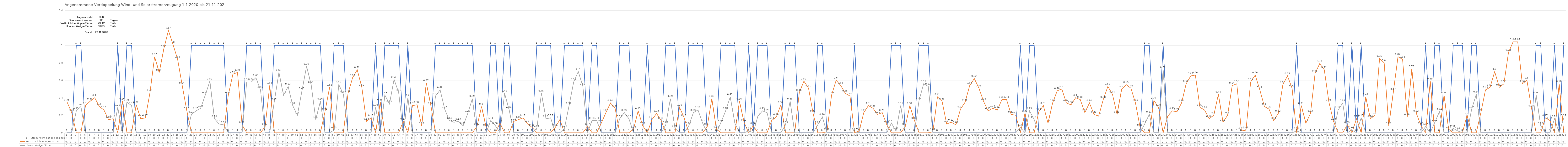
| Category | 1 = Strom reicht auf den Tag aus | Zussätzlich benötigter Strom | Überschüssiger Strom |
|---|---|---|---|
| 0 | 0 | 0.35 | 0 |
| 1 | 0 | 0.23 | 0 |
| 2 | 1 | 0 | 0.25 |
| 3 | 1 | 0 | 0.3 |
| 4 | 0 | 0.31 | 0 |
| 5 | 0 | 0.36 | 0 |
| 6 | 0 | 0.4 | 0 |
| 7 | 0 | 0.3 | 0 |
| 8 | 0 | 0.26 | 0 |
| 9 | 0 | 0.15 | 0 |
| 10 | 0 | 0.16 | 0 |
| 11 | 1 | 0 | 0.29 |
| 12 | 0 | 0.36 | 0 |
| 13 | 1 | 0 | 0.35 |
| 14 | 1 | 0 | 0.31 |
| 15 | 0 | 0.32 | 0 |
| 16 | 0 | 0.16 | 0 |
| 17 | 0 | 0.17 | 0 |
| 18 | 0 | 0.46 | 0 |
| 19 | 0 | 0.87 | 0 |
| 20 | 0 | 0.69 | 0 |
| 21 | 0 | 0.96 | 0 |
| 22 | 0 | 1.17 | 0 |
| 23 | 0 | 1.01 | 0 |
| 24 | 0 | 0.84 | 0 |
| 25 | 0 | 0.54 | 0 |
| 26 | 0 | 0.25 | 0 |
| 27 | 1 | 0 | 0.21 |
| 28 | 1 | 0 | 0.25 |
| 29 | 1 | 0 | 0.28 |
| 30 | 1 | 0 | 0.43 |
| 31 | 1 | 0 | 0.59 |
| 32 | 1 | 0 | 0.16 |
| 33 | 1 | 0 | 0.1 |
| 34 | 1 | 0 | 0.09 |
| 35 | 0 | 0.43 | 0 |
| 36 | 0 | 0.67 | 0 |
| 37 | 0 | 0.69 | 0 |
| 38 | 0 | 0.09 | 0 |
| 39 | 1 | 0 | 0.58 |
| 40 | 1 | 0 | 0.58 |
| 41 | 1 | 0 | 0.63 |
| 42 | 1 | 0 | 0.49 |
| 43 | 0 | 0.07 | 0 |
| 44 | 0 | 0.54 | 0 |
| 45 | 1 | 0 | 0.36 |
| 46 | 1 | 0 | 0.69 |
| 47 | 1 | 0 | 0.43 |
| 48 | 1 | 0 | 0.53 |
| 49 | 1 | 0 | 0.31 |
| 50 | 1 | 0 | 0.2 |
| 51 | 1 | 0 | 0.48 |
| 52 | 1 | 0 | 0.76 |
| 53 | 1 | 0 | 0.55 |
| 54 | 1 | 0 | 0.15 |
| 55 | 1 | 0 | 0.36 |
| 56 | 0 | 0.24 | 0 |
| 57 | 0 | 0.52 | 0 |
| 58 | 1 | 0 | 0.03 |
| 59 | 1 | 0 | 0.55 |
| 60 | 1 | 0 | 0.44 |
| 61 | 0 | 0.45 | 0 |
| 62 | 0 | 0.63 | 0 |
| 63 | 0 | 0.72 | 0 |
| 64 | 0 | 0.52 | 0 |
| 65 | 0 | 0.13 | 0 |
| 66 | 0 | 0.17 | 0 |
| 67 | 1 | 0 | 0.29 |
| 68 | 0 | 0.35 | 0 |
| 69 | 1 | 0 | 0.43 |
| 70 | 1 | 0 | 0.33 |
| 71 | 1 | 0 | 0.61 |
| 72 | 1 | 0 | 0.46 |
| 73 | 0 | 0.13 | 0 |
| 74 | 1 | 0 | 0.4 |
| 75 | 0 | 0.31 | 0 |
| 76 | 0 | 0.32 | 0 |
| 77 | 0 | 0.08 | 0 |
| 78 | 0 | 0.57 | 0 |
| 79 | 0 | 0.31 | 0 |
| 80 | 1 | 0 | 0.42 |
| 81 | 1 | 0 | 0.49 |
| 82 | 1 | 0 | 0.27 |
| 83 | 1 | 0 | 0.14 |
| 84 | 1 | 0 | 0.12 |
| 85 | 1 | 0 | 0.13 |
| 86 | 1 | 0 | 0.08 |
| 87 | 1 | 0 | 0.22 |
| 88 | 1 | 0 | 0.39 |
| 89 | 0 | 0.07 | 0 |
| 90 | 0 | 0.3 | 0 |
| 91 | 0 | 0.06 | 0 |
| 92 | 1 | 0 | 0.14 |
| 93 | 1 | 0 | 0.08 |
| 94 | 0 | 0.11 | 0 |
| 95 | 1 | 0 | 0.45 |
| 96 | 1 | 0 | 0.26 |
| 97 | 0 | 0.13 | 0 |
| 98 | 0 | 0.15 | 0 |
| 99 | 0 | 0.17 | 0 |
| 100 | 0 | 0.1 | 0 |
| 101 | 0 | 0.06 | 0 |
| 102 | 1 | 0 | 0.05 |
| 103 | 1 | 0 | 0.45 |
| 104 | 1 | 0 | 0.16 |
| 105 | 1 | 0 | 0.17 |
| 106 | 0 | 0.06 | 0 |
| 107 | 0 | 0.15 | 0 |
| 108 | 1 | 0 | 0.05 |
| 109 | 1 | 0 | 0.31 |
| 110 | 1 | 0 | 0.58 |
| 111 | 1 | 0 | 0.7 |
| 112 | 1 | 0 | 0.53 |
| 113 | 0 | 0.07 | 0 |
| 114 | 1 | 0 | 0.14 |
| 115 | 1 | 0 | 0.14 |
| 116 | 0 | 0.11 | 0 |
| 117 | 0 | 0.23 | 0 |
| 118 | 0 | 0.34 | 0 |
| 119 | 0 | 0.28 | 0 |
| 120 | 1 | 0 | 0.16 |
| 121 | 1 | 0 | 0.23 |
| 122 | 1 | 0 | 0.16 |
| 123 | 0 | 0.04 | 0 |
| 124 | 0 | 0.25 | 0 |
| 125 | 0 | 0.08 | 0 |
| 126 | 1 | 0 | 0 |
| 127 | 0 | 0.15 | 0 |
| 128 | 0 | 0.22 | 0 |
| 129 | 0 | 0.14 | 0 |
| 130 | 1 | 0 | 0.09 |
| 131 | 1 | 0 | 0.39 |
| 132 | 1 | 0 | 0.05 |
| 133 | 0 | 0.29 | 0 |
| 134 | 0 | 0.17 | 0 |
| 135 | 1 | 0 | 0.08 |
| 136 | 1 | 0 | 0.23 |
| 137 | 1 | 0 | 0.26 |
| 138 | 1 | 0 | 0.11 |
| 139 | 0 | 0.07 | 0 |
| 140 | 0 | 0.39 | 0 |
| 141 | 0 | 0.04 | 0 |
| 142 | 1 | 0 | 0.12 |
| 143 | 1 | 0 | 0.25 |
| 144 | 1 | 0 | 0.41 |
| 145 | 1 | 0 | 0.11 |
| 146 | 0 | 0.36 | 0 |
| 147 | 0 | 0.12 | 0 |
| 148 | 1 | 0 | 0.02 |
| 149 | 0 | 0.08 | 0 |
| 150 | 1 | 0 | 0.19 |
| 151 | 1 | 0 | 0.25 |
| 152 | 1 | 0 | 0.23 |
| 153 | 0 | 0.14 | 0 |
| 154 | 0 | 0.18 | 0 |
| 155 | 0 | 0.32 | 0 |
| 156 | 1 | 0 | 0.09 |
| 157 | 1 | 0 | 0.36 |
| 158 | 1 | 0 | 0 |
| 159 | 0 | 0.46 | 0 |
| 160 | 0 | 0.59 | 0 |
| 161 | 0 | 0.51 | 0 |
| 162 | 0 | 0.22 | 0 |
| 163 | 1 | 0 | 0.09 |
| 164 | 1 | 0 | 0.18 |
| 165 | 0 | 0.01 | 0 |
| 166 | 0 | 0.43 | 0 |
| 167 | 0 | 0.6 | 0 |
| 168 | 0 | 0.54 | 0 |
| 169 | 0 | 0.45 | 0 |
| 170 | 0 | 0.42 | 0 |
| 171 | 1 | 0 | 0.01 |
| 172 | 0 | 0.02 | 0 |
| 173 | 0 | 0.23 | 0 |
| 174 | 0 | 0.31 | 0 |
| 175 | 0 | 0.28 | 0 |
| 176 | 0 | 0.21 | 0 |
| 177 | 0 | 0.23 | 0 |
| 178 | 0 | 0.09 | 0 |
| 179 | 1 | 0 | 0.11 |
| 180 | 1 | 0 | 0.02 |
| 181 | 1 | 0 | 0.31 |
| 182 | 0 | 0.07 | 0 |
| 183 | 0 | 0.31 | 0 |
| 184 | 0 | 0.14 | 0 |
| 185 | 1 | 0 | 0.37 |
| 186 | 1 | 0 | 0.56 |
| 187 | 1 | 0 | 0.53 |
| 188 | 0 | 0.01 | 0 |
| 189 | 0 | 0.41 | 0 |
| 190 | 0 | 0.36 | 0 |
| 191 | 0 | 0.1 | 0 |
| 192 | 0 | 0.12 | 0 |
| 193 | 0 | 0.09 | 0 |
| 194 | 0 | 0.27 | 0 |
| 195 | 0 | 0.35 | 0 |
| 196 | 0 | 0.54 | 0 |
| 197 | 0 | 0.62 | 0 |
| 198 | 0 | 0.51 | 0 |
| 199 | 0 | 0.36 | 0 |
| 200 | 0 | 0.25 | 0 |
| 201 | 0 | 0.28 | 0 |
| 202 | 0 | 0.26 | 0 |
| 203 | 0 | 0.38 | 0 |
| 204 | 0 | 0.38 | 0 |
| 205 | 0 | 0.21 | 0 |
| 206 | 0 | 0.2 | 0 |
| 207 | 1 | 0 | 0.06 |
| 208 | 0 | 0.22 | 0 |
| 209 | 1 | 0 | 0.25 |
| 210 | 1 | 0 | 0.15 |
| 211 | 0 | 0.24 | 0 |
| 212 | 0 | 0.31 | 0 |
| 213 | 0 | 0.11 | 0 |
| 214 | 0 | 0.34 | 0 |
| 215 | 0 | 0.48 | 0 |
| 216 | 0 | 0.5 | 0 |
| 217 | 0 | 0.34 | 0 |
| 218 | 0 | 0.32 | 0 |
| 219 | 0 | 0.4 | 0 |
| 220 | 0 | 0.38 | 0 |
| 221 | 0 | 0.23 | 0 |
| 222 | 0 | 0.34 | 0 |
| 223 | 0 | 0.21 | 0 |
| 224 | 0 | 0.19 | 0 |
| 225 | 0 | 0.38 | 0 |
| 226 | 0 | 0.53 | 0 |
| 227 | 0 | 0.44 | 0 |
| 228 | 0 | 0.21 | 0 |
| 229 | 0 | 0.5 | 0 |
| 230 | 0 | 0.55 | 0 |
| 231 | 0 | 0.51 | 0 |
| 232 | 0 | 0.34 | 0 |
| 233 | 0 | 0.06 | 0 |
| 234 | 1 | 0 | 0.1 |
| 235 | 1 | 0 | 0.21 |
| 236 | 0 | 0.37 | 0 |
| 237 | 0 | 0.29 | 0 |
| 238 | 1 | 0 | 0.72 |
| 239 | 0 | 0.19 | 0 |
| 240 | 0 | 0.25 | 0 |
| 241 | 0 | 0.24 | 0 |
| 242 | 0 | 0.34 | 0 |
| 243 | 0 | 0.56 | 0 |
| 244 | 0 | 0.65 | 0 |
| 245 | 0 | 0.66 | 0 |
| 246 | 0 | 0.29 | 0 |
| 247 | 0 | 0.26 | 0 |
| 248 | 0 | 0.16 | 0 |
| 249 | 0 | 0.2 | 0 |
| 250 | 0 | 0.44 | 0 |
| 251 | 0 | 0.12 | 0 |
| 252 | 0 | 0.2 | 0 |
| 253 | 0 | 0.54 | 0 |
| 254 | 0 | 0.56 | 0 |
| 255 | 0 | 0.02 | 0 |
| 256 | 0 | 0.03 | 0 |
| 257 | 0 | 0.58 | 0 |
| 258 | 0 | 0.66 | 0 |
| 259 | 0 | 0.49 | 0 |
| 260 | 0 | 0.3 | 0 |
| 261 | 0 | 0.27 | 0 |
| 262 | 0 | 0.14 | 0 |
| 263 | 0 | 0.22 | 0 |
| 264 | 0 | 0.55 | 0 |
| 265 | 0 | 0.65 | 0 |
| 266 | 0 | 0.51 | 0 |
| 267 | 1 | 0 | 0.02 |
| 268 | 0 | 0.31 | 0 |
| 269 | 0 | 0.11 | 0 |
| 270 | 0 | 0.22 | 0 |
| 271 | 0 | 0.68 | 0 |
| 272 | 0 | 0.79 | 0 |
| 273 | 0 | 0.72 | 0 |
| 274 | 0 | 0.35 | 0 |
| 275 | 0 | 0.13 | 0 |
| 276 | 1 | 0 | 0.26 |
| 277 | 1 | 0 | 0.34 |
| 278 | 0 | 0.09 | 0 |
| 279 | 1 | 0 | 0.03 |
| 280 | 0 | 0.16 | 0 |
| 281 | 1 | 0 | 0.17 |
| 282 | 0 | 0.41 | 0 |
| 283 | 0 | 0.16 | 0 |
| 284 | 0 | 0.2 | 0 |
| 285 | 0 | 0.85 | 0 |
| 286 | 0 | 0.8 | 0 |
| 287 | 0 | 0.08 | 0 |
| 288 | 0 | 0.47 | 0 |
| 289 | 0 | 0.87 | 0 |
| 290 | 0 | 0.84 | 0 |
| 291 | 0 | 0.18 | 0 |
| 292 | 0 | 0.73 | 0 |
| 293 | 0 | 0.22 | 0 |
| 294 | 0 | 0.08 | 0 |
| 295 | 1 | 0 | 0.07 |
| 296 | 0 | 0.59 | 0 |
| 297 | 1 | 0 | 0.12 |
| 298 | 1 | 0 | 0.24 |
| 299 | 0 | 0.43 | 0 |
| 300 | 0 | 0.04 | 0 |
| 301 | 1 | 0 | 0.05 |
| 302 | 1 | 0 | 0.02 |
| 303 | 1 | 0 | 0 |
| 304 | 0 | 0.2 | 0 |
| 305 | 1 | 0 | 0.27 |
| 306 | 1 | 0 | 0.44 |
| 307 | 0 | 0.23 | 0 |
| 308 | 0 | 0.49 | 0 |
| 309 | 0 | 0.52 | 0 |
| 310 | 0 | 0.7 | 0 |
| 311 | 0 | 0.52 | 0 |
| 312 | 0 | 0.56 | 0 |
| 313 | 0 | 0.92 | 0 |
| 314 | 0 | 1.04 | 0 |
| 315 | 0 | 1.04 | 0 |
| 316 | 0 | 0.56 | 0 |
| 317 | 0 | 0.6 | 0 |
| 318 | 0 | 0.28 | 0 |
| 319 | 1 | 0 | 0.43 |
| 320 | 1 | 0 | 0.08 |
| 321 | 0 | 0.17 | 0 |
| 322 | 0 | 0.14 | 0 |
| 323 | 1 | 0 | 0.16 |
| 324 | 0 | 0.56 | 0 |
| 325 | 1 | 0 | 0.17 |